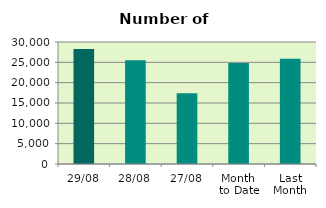
| Category | Series 0 |
|---|---|
| 29/08 | 28268 |
| 28/08 | 25496 |
| 27/08 | 17392 |
| Month 
to Date | 24831.143 |
| Last
Month | 25883.727 |